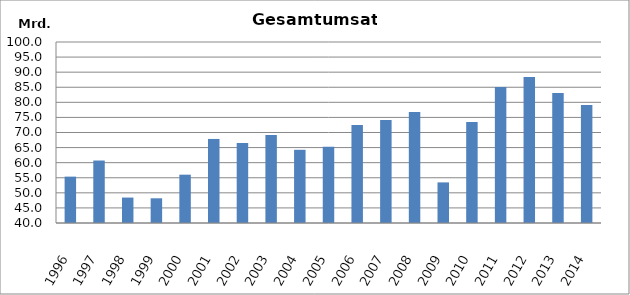
| Category | Series 0 |
|---|---|
| 1996.0 | 55371956 |
| 1997.0 | 60710454 |
| 1998.0 | 48430705 |
| 1999.0 | 48190293 |
| 2000.0 | 56014702 |
| 2001.0 | 67861795 |
| 2002.0 | 66481294 |
| 2003.0 | 69161973 |
| 2004.0 | 64266307 |
| 2005.0 | 65293897 |
| 2006.0 | 72514648 |
| 2007.0 | 74176770 |
| 2008.0 | 76788139 |
| 2009.0 | 53462495 |
| 2010.0 | 73497409.496 |
| 2011.0 | 85064473 |
| 2012.0 | 88419481 |
| 2013.0 | 83060160.429 |
| 2014.0 | 79153644.015 |